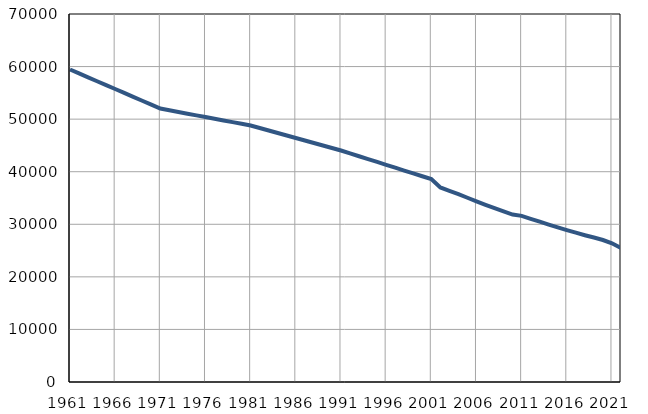
| Category | Population
size |
|---|---|
| 1961.0 | 59445 |
| 1962.0 | 58702 |
| 1963.0 | 57958 |
| 1964.0 | 57215 |
| 1965.0 | 56471 |
| 1966.0 | 55728 |
| 1967.0 | 54984 |
| 1968.0 | 54241 |
| 1969.0 | 53497 |
| 1970.0 | 52754 |
| 1971.0 | 52010 |
| 1972.0 | 51688 |
| 1973.0 | 51366 |
| 1974.0 | 51043 |
| 1975.0 | 50722 |
| 1976.0 | 50400 |
| 1977.0 | 50078 |
| 1978.0 | 49756 |
| 1979.0 | 49433 |
| 1980.0 | 49111 |
| 1981.0 | 48789 |
| 1982.0 | 48314 |
| 1983.0 | 47838 |
| 1984.0 | 47363 |
| 1985.0 | 46888 |
| 1986.0 | 46413 |
| 1987.0 | 45937 |
| 1988.0 | 45462 |
| 1989.0 | 44987 |
| 1990.0 | 44511 |
| 1991.0 | 44036 |
| 1992.0 | 43492 |
| 1993.0 | 42947 |
| 1994.0 | 42402 |
| 1995.0 | 41857 |
| 1996.0 | 41312 |
| 1997.0 | 40768 |
| 1998.0 | 40222 |
| 1999.0 | 39677 |
| 2000.0 | 39133 |
| 2001.0 | 38589 |
| 2002.0 | 36998 |
| 2003.0 | 36372 |
| 2004.0 | 35744 |
| 2005.0 | 35047 |
| 2006.0 | 34345 |
| 2007.0 | 33684 |
| 2008.0 | 33051 |
| 2009.0 | 32447 |
| 2010.0 | 31851 |
| 2011.0 | 31603 |
| 2012.0 | 31042 |
| 2013.0 | 30490 |
| 2014.0 | 29948 |
| 2015.0 | 29413 |
| 2016.0 | 28896 |
| 2017.0 | 28402 |
| 2018.0 | 27921 |
| 2019.0 | 27476 |
| 2020.0 | 27005 |
| 2021.0 | 26382 |
| 2022.0 | 25469 |